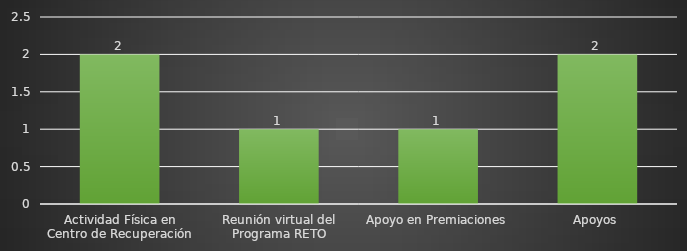
| Category | INDICADOR  |
|---|---|
| Actividad Física en Centro de Recuperación | 2 |
| Reunión virtual del Programa RETO | 1 |
| Apoyo en Premiaciones | 1 |
| Apoyos | 2 |